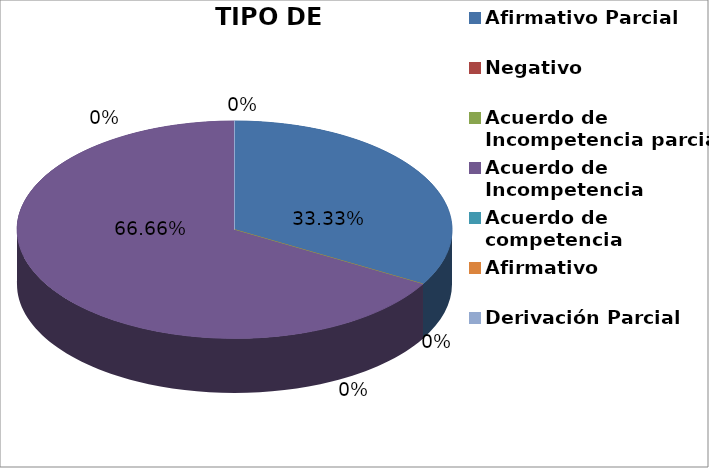
| Category | Series 0 |
|---|---|
| Afirmativo Parcial | 1 |
| Negativo | 0 |
| Acuerdo de Incompetencia parcial | 0 |
| Acuerdo de Incompetencia | 2 |
| Acuerdo de competencia | 0 |
| Afirmativo | 0 |
| Derivación Parcial | 0 |